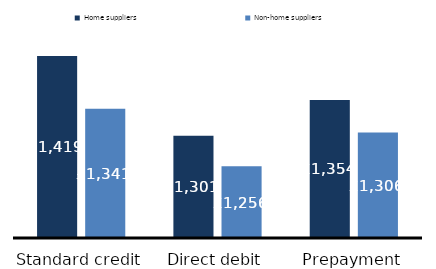
| Category | Home suppliers | Non-home suppliers |
|---|---|---|
| Standard credit | 1419 | 1341 |
| Direct debit | 1301 | 1256 |
| Prepayment | 1354 | 1306 |